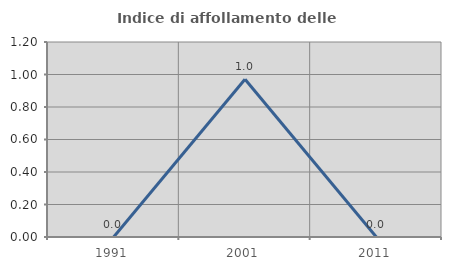
| Category | Indice di affollamento delle abitazioni  |
|---|---|
| 1991.0 | 0 |
| 2001.0 | 0.971 |
| 2011.0 | 0 |